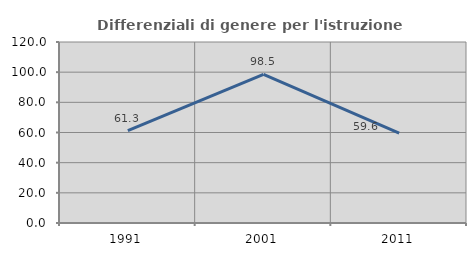
| Category | Differenziali di genere per l'istruzione superiore |
|---|---|
| 1991.0 | 61.253 |
| 2001.0 | 98.474 |
| 2011.0 | 59.632 |